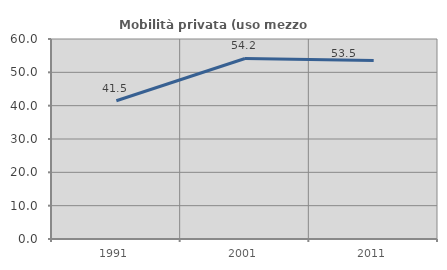
| Category | Mobilità privata (uso mezzo privato) |
|---|---|
| 1991.0 | 41.463 |
| 2001.0 | 54.161 |
| 2011.0 | 53.534 |